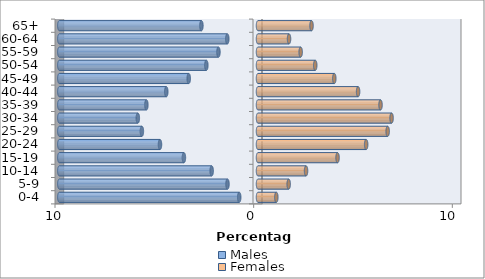
| Category | Males | Females |
|---|---|---|
| 0-4 | -0.945 | 0.922 |
| 5-9 | -1.536 | 1.544 |
| 10-14 | -2.333 | 2.419 |
| 15-19 | -3.73 | 4.005 |
| 20-24 | -4.934 | 5.445 |
| 25-29 | -5.845 | 6.527 |
| 30-34 | -6.049 | 6.724 |
| 35-39 | -5.619 | 6.168 |
| 40-44 | -4.617 | 5.039 |
| 45-49 | -3.486 | 3.841 |
| 50-54 | -2.6 | 2.882 |
| 55-59 | -1.991 | 2.147 |
| 60-64 | -1.546 | 1.562 |
| 65+ | -2.849 | 2.695 |